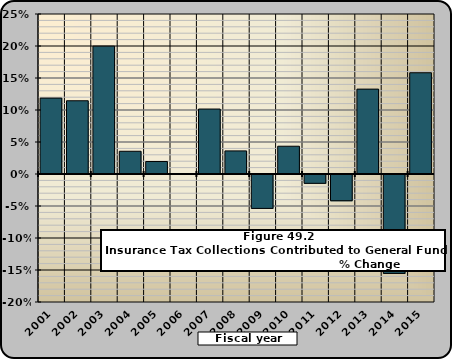
| Category | 11.86% |
|---|---|
| 2001.0 | 0.119 |
| 2002.0 | 0.114 |
| 2003.0 | 0.2 |
| 2004.0 | 0.036 |
| 2005.0 | 0.02 |
| 2006.0 | 0 |
| 2007.0 | 0.101 |
| 2008.0 | 0.036 |
| 2009.0 | -0.053 |
| 2010.0 | 0.043 |
| 2011.0 | -0.014 |
| 2012.0 | -0.041 |
| 2013.0 | 0.133 |
| 2014.0 | -0.155 |
| 2015.0 | 0.158 |